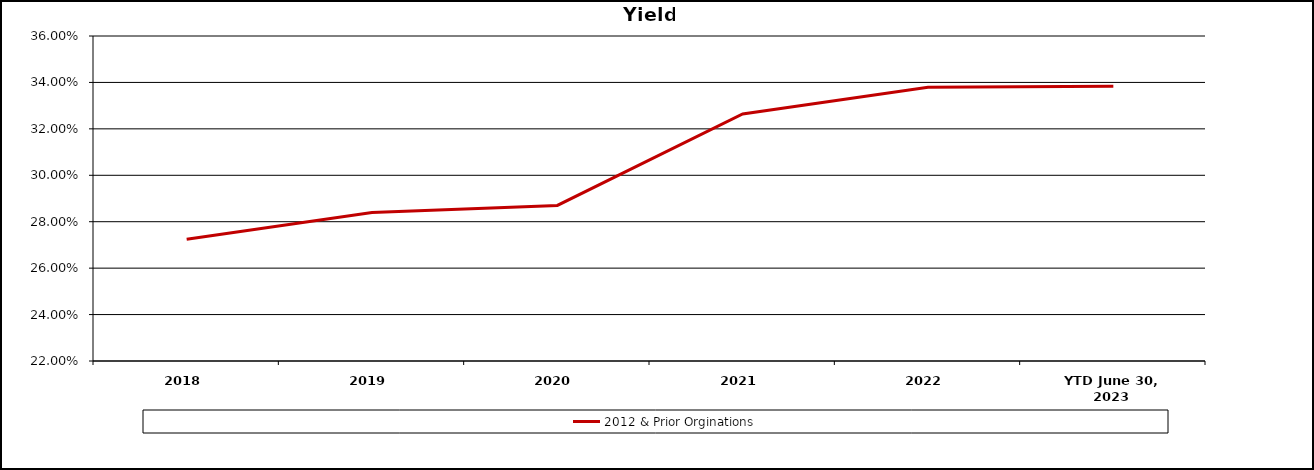
| Category | 2012 & Prior Orginations |
|---|---|
| 2018 | 0.272 |
| 2019 | 0.284 |
| 2020 | 0.287 |
| 2021 | 0.326 |
| 2022 | 0.338 |
| YTD June 30, 2023 | 0.338 |